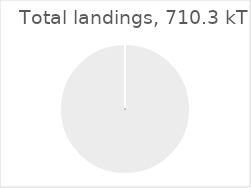
| Category | Total landings (kT)** |
|---|---|
| Total landings (kT)** | 710.271 |